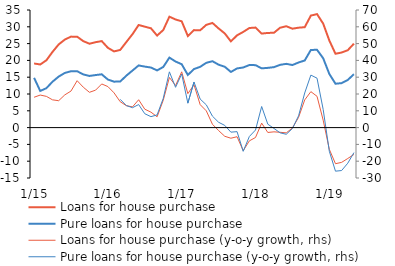
| Category | Loans for house purchase | Pure loans for house purchase |
|---|---|---|
|  1/15 | 19.084 | 14.817 |
| 2 | 18.787 | 10.906 |
| 3 | 20.029 | 11.73 |
| 4 | 22.529 | 13.662 |
| 5 | 24.752 | 15.182 |
| 6 | 26.195 | 16.268 |
| 7 | 27.076 | 16.771 |
| 8 | 27.066 | 16.781 |
| 9 | 25.73 | 15.828 |
| 10 | 24.967 | 15.375 |
| 11 | 25.42 | 15.639 |
| 12 | 25.743 | 15.861 |
|  1/16 | 23.745 | 14.299 |
| 2 | 22.673 | 13.677 |
| 3 | 23.115 | 13.704 |
| 4 | 25.469 | 15.456 |
| 5 | 27.807 | 16.98 |
| 6 | 30.54 | 18.499 |
| 7 | 30.042 | 18.154 |
| 8 | 29.555 | 17.875 |
| 9 | 27.388 | 17.023 |
| 10 | 29.036 | 18.044 |
| 11 | 33.011 | 20.829 |
| 12 | 32.18 | 19.666 |
|  1/17 | 31.63 | 18.86 |
| 2 | 27.255 | 15.667 |
| 3 | 29.015 | 17.424 |
| 4 | 28.955 | 18.083 |
| 5 | 30.579 | 19.281 |
| 6 | 31.145 | 19.759 |
| 7 | 29.509 | 18.729 |
| 8 | 28.03 | 18.109 |
| 9 | 25.655 | 16.561 |
| 10 | 27.462 | 17.612 |
| 11 | 28.474 | 17.888 |
| 12 | 29.638 | 18.625 |
|  1/18 | 29.767 | 18.587 |
| 2 | 27.982 | 17.634 |
| 3 | 28.173 | 17.779 |
| 4 | 28.224 | 17.993 |
| 5 | 29.726 | 18.68 |
| 6 | 30.168 | 18.974 |
| 7 | 29.437 | 18.624 |
| 8 | 29.74 | 19.378 |
| 9 | 29.882 | 19.973 |
| 10 | 33.339 | 23.116 |
| 11 | 33.777 | 23.15 |
| 12 | 30.952 | 20.645 |
|  1/19 | 25.923 | 15.968 |
| 2 | 21.972 | 13.06 |
| 3 | 22.344 | 13.235 |
| 4 | 23.035 | 14.181 |
| 5 | 24.98 | 15.898 |